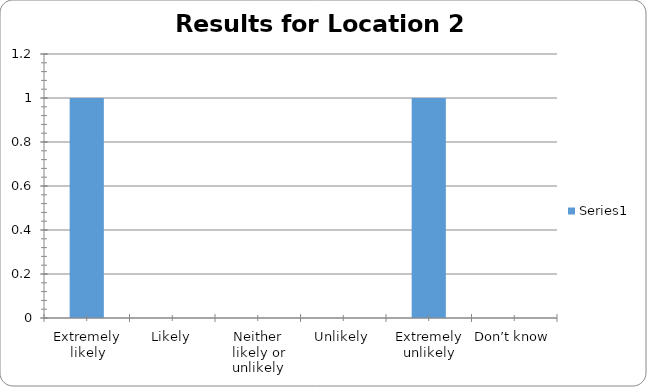
| Category | Series 0 |
|---|---|
| Extremely likely | 1 |
| Likely | 0 |
| Neither likely or unlikely | 0 |
| Unlikely | 0 |
| Extremely unlikely | 1 |
| Don’t know | 0 |